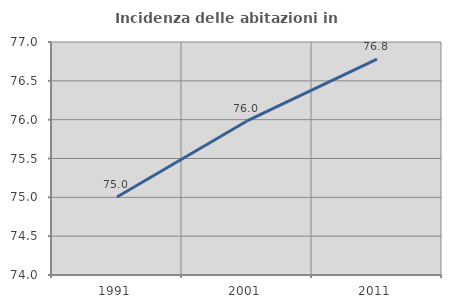
| Category | Incidenza delle abitazioni in proprietà  |
|---|---|
| 1991.0 | 75.005 |
| 2001.0 | 75.983 |
| 2011.0 | 76.779 |